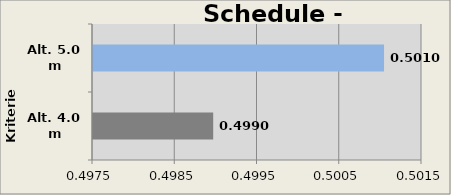
| Category | P. Columns |
|---|---|
| Alt. 4.0 m | 0.499 |
| Alt. 5.0 m | 0.501 |